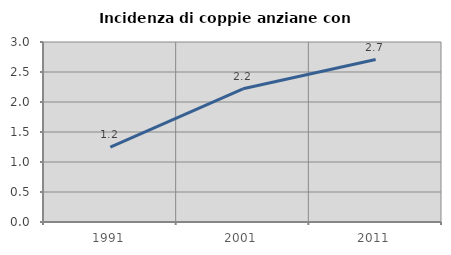
| Category | Incidenza di coppie anziane con figli |
|---|---|
| 1991.0 | 1.247 |
| 2001.0 | 2.22 |
| 2011.0 | 2.708 |